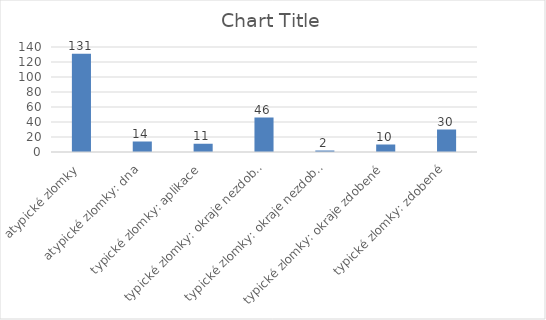
| Category | Series 0 |
|---|---|
| atypické zlomky | 131 |
| atypické zlomky: dna | 14 |
| typické zlomky: aplikace | 11 |
| typické zlomky: okraje nezdobené | 46 |
| typické zlomky: okraje nezdobené s uchem | 2 |
| typické zlomky: okraje zdobené | 10 |
| typické zlomky: zdobené | 30 |